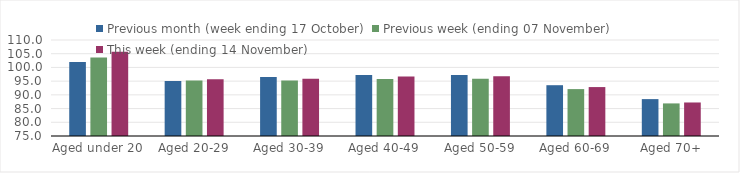
| Category | Previous month (week ending 17 October) | Previous week (ending 07 November) | This week (ending 14 November) |
|---|---|---|---|
| Aged under 20 | 101.96 | 103.66 | 105.73 |
| Aged 20-29 | 95.05 | 95.19 | 95.7 |
| Aged 30-39 | 96.55 | 95.25 | 95.89 |
| Aged 40-49 | 97.28 | 95.81 | 96.68 |
| Aged 50-59 | 97.27 | 95.86 | 96.77 |
| Aged 60-69 | 93.52 | 92.1 | 92.84 |
| Aged 70+ | 88.45 | 86.88 | 87.22 |